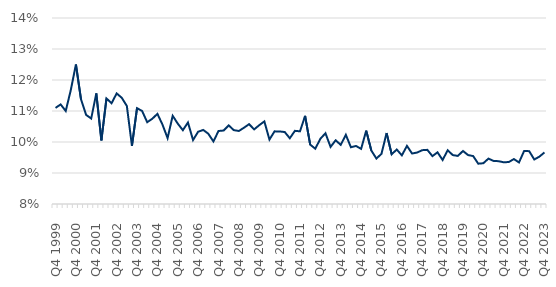
| Category | Series 0 |
|---|---|
| Q4 1999 | 11.1 |
| Q1 2000 | 11.212 |
| Q2 2000 | 11 |
| Q3 2000 | 11.68 |
| Q4 2000 | 12.5 |
| Q1 2001 | 11.375 |
| Q2 2001 | 10.875 |
| Q3 2001 | 10.756 |
| Q4 2001 | 11.57 |
| Q1 2002 | 10.05 |
| Q2 2002 | 11.405 |
| Q3 2002 | 11.25 |
| Q4 2002 | 11.567 |
| Q1 2003 | 11.427 |
| Q2 2003 | 11.162 |
| Q3 2003 | 9.875 |
| Q4 2003 | 11.092 |
| Q1 2004 | 11 |
| Q2 2004 | 10.639 |
| Q3 2004 | 10.75 |
| Q4 2004 | 10.909 |
| Q1 2005 | 10.56 |
| Q2 2005 | 10.125 |
| Q3 2005 | 10.845 |
| Q4 2005 | 10.593 |
| Q1 2006 | 10.38 |
| Q2 2006 | 10.63 |
| Q3 2006 | 10.063 |
| Q4 2006 | 10.332 |
| Q1 2007 | 10.389 |
| Q2 2007 | 10.265 |
| Q3 2007 | 10.018 |
| Q4 2007 | 10.355 |
| Q1 2008 | 10.37 |
| Q2 2008 | 10.536 |
| Q3 2008 | 10.383 |
| Q4 2008 | 10.356 |
| Q1 2009 | 10.461 |
| Q2 2009 | 10.575 |
| Q3 2009 | 10.408 |
| Q4 2009 | 10.543 |
| Q1 2010 | 10.664 |
| Q2 2010 | 10.078 |
| Q3 2010 | 10.343 |
| Q4 2010 | 10.341 |
| Q1 2011 | 10.322 |
| Q2 2011 | 10.121 |
| Q3 2011 | 10.36 |
| Q4 2011 | 10.345 |
| Q1 2012 | 10.843 |
| Q2 2012 | 9.915 |
| Q3 2012 | 9.784 |
| Q4 2012 | 10.104 |
| Q1 2013 | 10.282 |
| Q2 2013 | 9.841 |
| Q3 2013 | 10.056 |
| Q4 2013 | 9.908 |
| Q1 2014 | 10.232 |
| Q2 2014 | 9.83 |
| Q3 2014 | 9.872 |
| Q4 2014 | 9.778 |
| Q1 2015 | 10.367 |
| Q2 2015 | 9.726 |
| Q3 2015 | 9.467 |
| Q4 2015 | 9.618 |
| Q1 2016 | 10.289 |
| Q2 2016 | 9.604 |
| Q3 2016 | 9.758 |
| Q4 2016 | 9.569 |
| Q1 2017 | 9.874 |
| Q2 2017 | 9.629 |
| Q3 2017 | 9.66 |
| Q4 2017 | 9.736 |
| Q1 2018 | 9.747 |
| Q2 2018 | 9.545 |
| Q3 2018 | 9.667 |
| Q4 2018 | 9.419 |
| Q1 2019 | 9.733 |
| Q2 2019 | 9.578 |
| Q3 2019 | 9.551 |
| Q4 2019 | 9.711 |
| Q1 2020 | 9.579 |
| Q2 2020 | 9.547 |
| Q3 2020 | 9.3 |
| Q4 2020 | 9.315 |
| Q1 2021 | 9.464 |
| Q2 2021 | 9.39 |
| Q3 2021 | 9.381 |
| Q4 2021 | 9.345 |
| Q1 2022 | 9.354 |
| Q2 2022 | 9.45 |
| Q3 2022 | 9.34 |
| Q4 2022 | 9.708 |
| Q1 2023 | 9.705 |
| Q2 2023 | 9.436 |
| Q3 2023 | 9.527 |
| Q4 2023 | 9.663 |